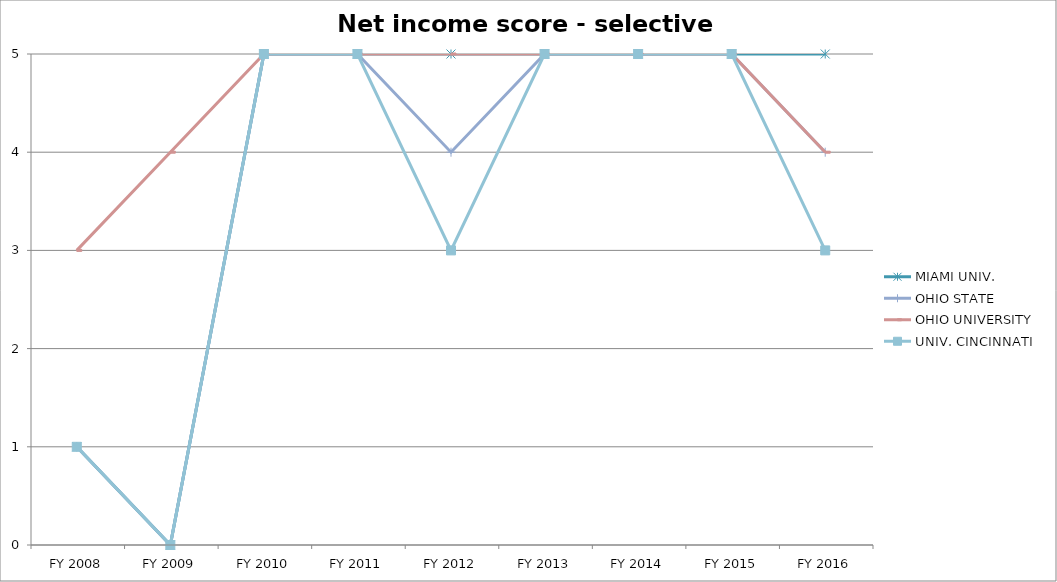
| Category | MIAMI UNIV.  | OHIO STATE  | OHIO UNIVERSITY  | UNIV. CINCINNATI  |
|---|---|---|---|---|
| FY 2016 | 5 | 4 | 4 | 3 |
| FY 2015 | 5 | 5 | 5 | 5 |
| FY 2014 | 5 | 5 | 5 | 5 |
| FY 2013 | 5 | 5 | 5 | 5 |
| FY 2012 | 5 | 4 | 5 | 3 |
| FY 2011 | 5 | 5 | 5 | 5 |
| FY 2010 | 5 | 5 | 5 | 5 |
| FY 2009 | 0 | 0 | 4 | 0 |
| FY 2008 | 1 | 1 | 3 | 1 |